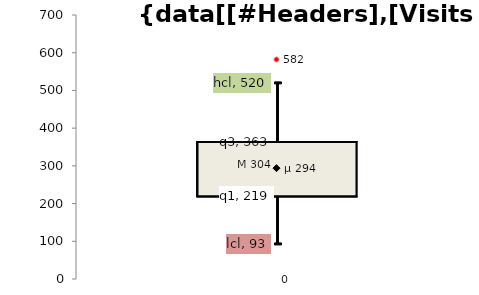
| Category | q1 | lcl | M | hcl | q3 |
|---|---|---|---|---|---|
| 0 | 219.25 | 93 | 304 | 520 | 363.25 |